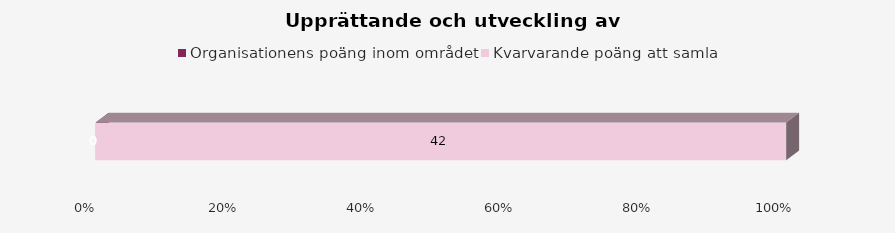
| Category | Organisationens poäng inom området | Kvarvarande poäng att samla |
|---|---|---|
| 0 | 0 | 42 |